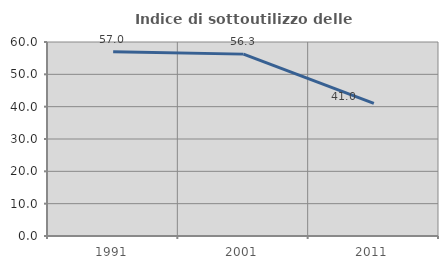
| Category | Indice di sottoutilizzo delle abitazioni  |
|---|---|
| 1991.0 | 56.962 |
| 2001.0 | 56.25 |
| 2011.0 | 41.026 |